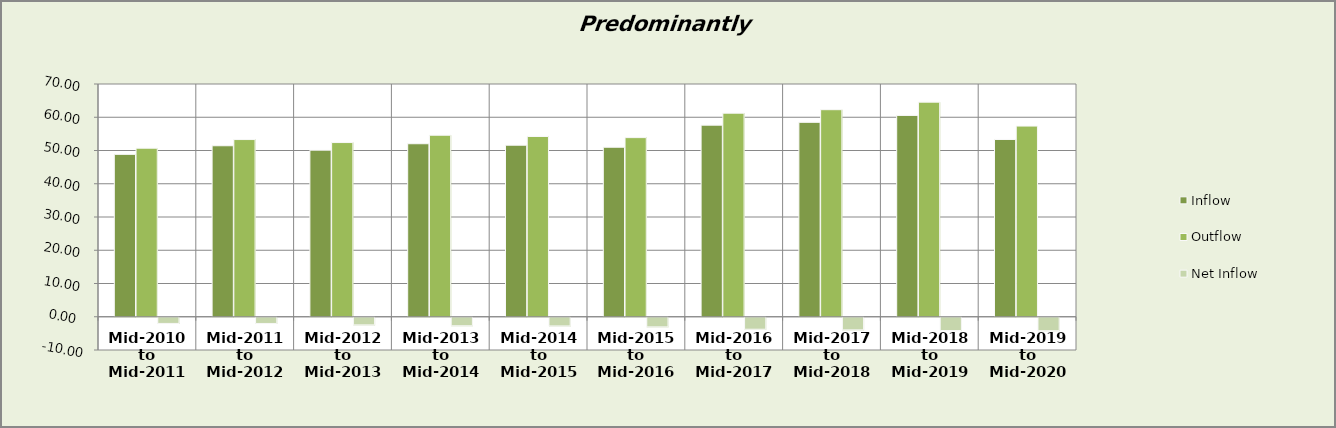
| Category | Inflow | Outflow | Net Inflow |
|---|---|---|---|
| Mid-2010 to Mid-2011 | 48.836 | 50.694 | -1.857 |
| Mid-2011 to Mid-2012 | 51.427 | 53.293 | -1.866 |
| Mid-2012 to Mid-2013 | 50.086 | 52.387 | -2.301 |
| Mid-2013 to Mid-2014 | 52.034 | 54.596 | -2.561 |
| Mid-2014 to Mid-2015 | 51.59 | 54.213 | -2.622 |
| Mid-2015 to Mid-2016 | 50.978 | 53.875 | -2.897 |
| Mid-2016 to Mid-2017 | 57.621 | 61.224 | -3.603 |
| Mid-2017 to Mid-2018 | 58.473 | 62.27 | -3.798 |
| Mid-2018 to Mid-2019 | 60.546 | 64.543 | -3.997 |
| Mid-2019 to Mid-2020 | 53.313 | 57.348 | -4.035 |